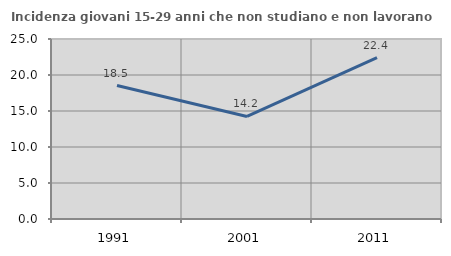
| Category | Incidenza giovani 15-29 anni che non studiano e non lavorano  |
|---|---|
| 1991.0 | 18.537 |
| 2001.0 | 14.243 |
| 2011.0 | 22.401 |